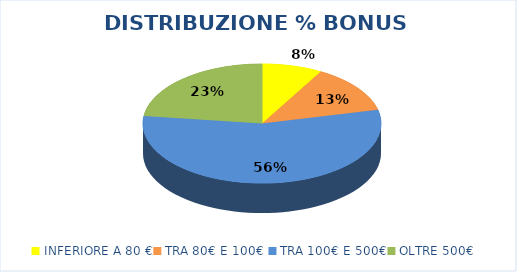
| Category | % |
|---|---|
| INFERIORE A 80 € | 0.082 |
| TRA 80€ E 100€  | 0.131 |
| TRA 100€ E 500€ | 0.557 |
| OLTRE 500€ | 0.23 |